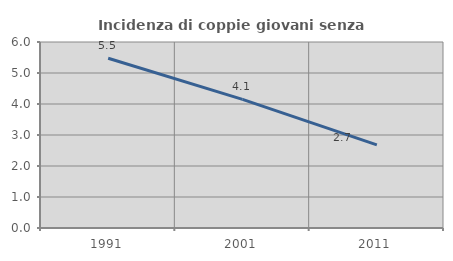
| Category | Incidenza di coppie giovani senza figli |
|---|---|
| 1991.0 | 5.475 |
| 2001.0 | 4.15 |
| 2011.0 | 2.68 |